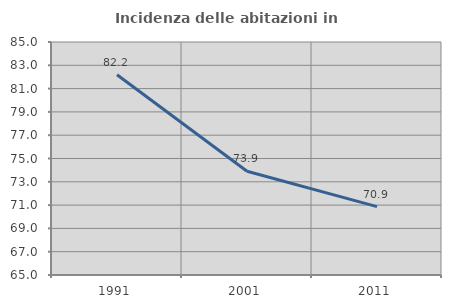
| Category | Incidenza delle abitazioni in proprietà  |
|---|---|
| 1991.0 | 82.194 |
| 2001.0 | 73.902 |
| 2011.0 | 70.866 |